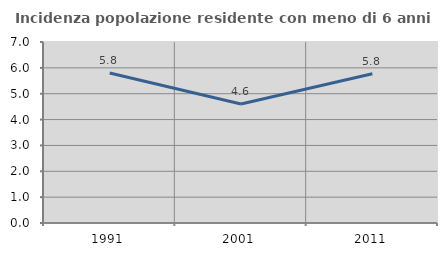
| Category | Incidenza popolazione residente con meno di 6 anni |
|---|---|
| 1991.0 | 5.799 |
| 2001.0 | 4.6 |
| 2011.0 | 5.772 |